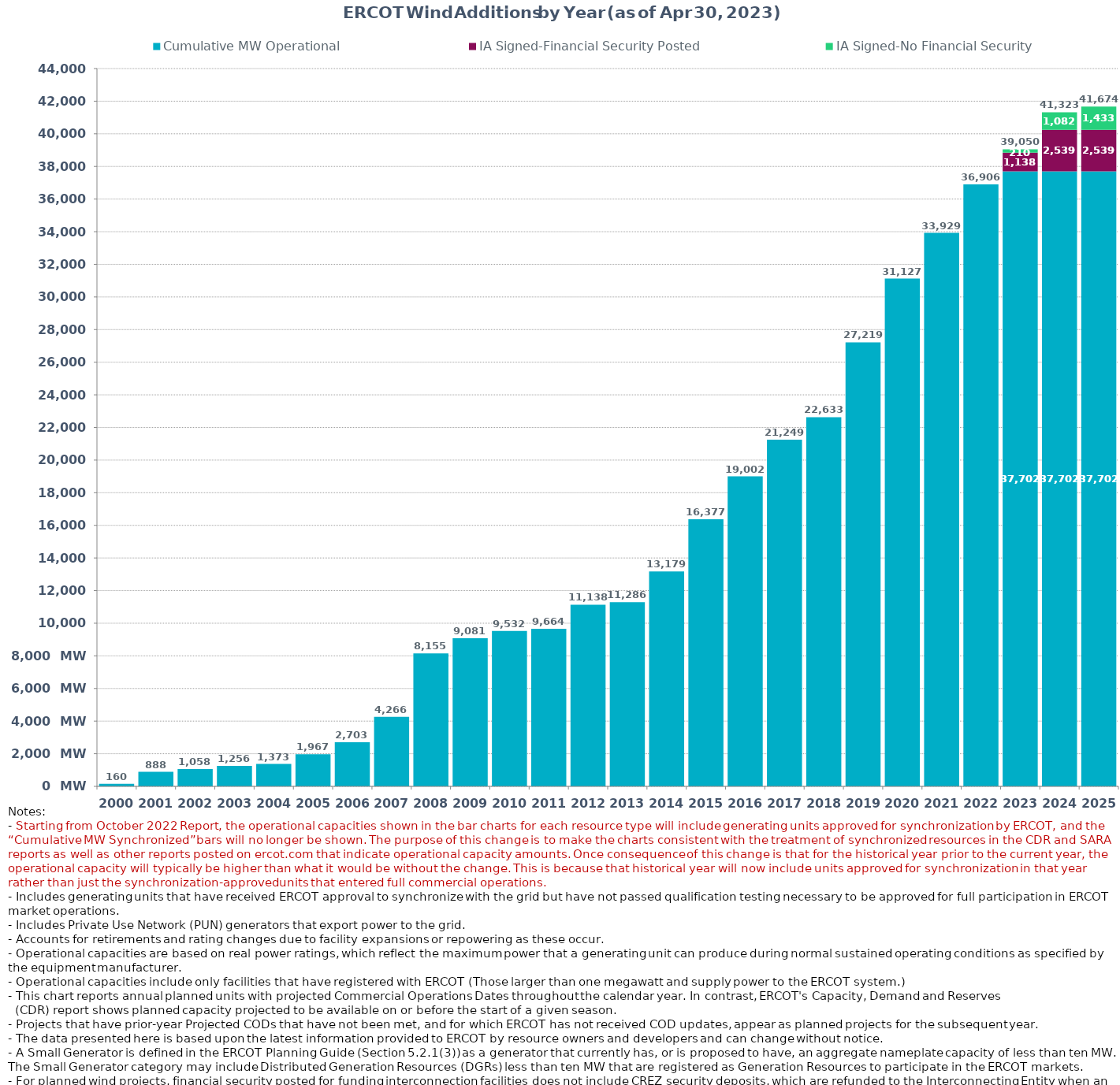
| Category | Cumulative MW Operational  | IA Signed-Financial Security Posted  | IA Signed-No Financial Security  | Other Planned | Cumulative Installed and Planned |
|---|---|---|---|---|---|
| 2000.0 | 160.37 | 0 | 0 | 0 | 160.37 |
| 2001.0 | 887.97 | 0 | 0 | 0 | 887.97 |
| 2002.0 | 1058.22 | 0 | 0 | 0 | 1058.22 |
| 2003.0 | 1255.72 | 0 | 0 | 0 | 1255.72 |
| 2004.0 | 1372.82 | 0 | 0 | 0 | 1372.82 |
| 2005.0 | 1967.04 | 0 | 0 | 0 | 1967.04 |
| 2006.0 | 2703.34 | 0 | 0 | 0 | 2703.34 |
| 2007.0 | 4266.36 | 0 | 0 | 0 | 4266.36 |
| 2008.0 | 8154.76 | 0 | 0 | 0 | 8154.76 |
| 2009.0 | 9080.78 | 0 | 0 | 0 | 9080.78 |
| 2010.0 | 9531.7 | 0 | 0 | 0 | 9531.7 |
| 2011.0 | 9663.7 | 0 | 0 | 0 | 9663.7 |
| 2012.0 | 11137.66 | 0 | 0 | 0 | 11137.66 |
| 2013.0 | 11286.26 | 0 | 0 | 0 | 11286.26 |
| 2014.0 | 13178.84 | 0 | 0 | 0 | 13178.84 |
| 2015.0 | 16376.53 | 0 | 0 | 0 | 16376.53 |
| 2016.0 | 19001.85 | 0 | 0 | 0 | 19001.85 |
| 2017.0 | 21248.99 | 0 | 0 | 0 | 21248.99 |
| 2018.0 | 22632.69 | 0 | 0 | 0 | 22632.69 |
| 2019.0 | 27219.34 | 0 | 0 | 0 | 27219.34 |
| 2020.0 | 31127.31 | 0 | 0 | 0 | 31127.31 |
| 2021.0 | 33928.91 | 0 | 0 | 0 | 33928.91 |
| 2022.0 | 36906.07 | 0 | 0 | 0 | 36906.07 |
| 2023.0 | 37702.33 | 1137.84 | 210 | 0 | 39050.17 |
| 2024.0 | 37702.33 | 2539.1 | 1081.71 | 0 | 41323.14 |
| 2025.0 | 37702.33 | 2539.1 | 1432.71 | 0 | 41674.14 |